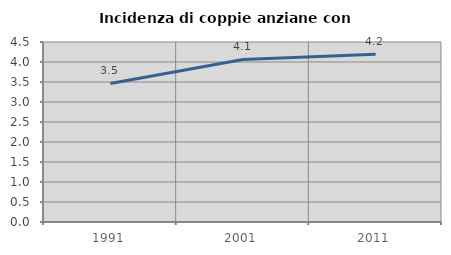
| Category | Incidenza di coppie anziane con figli |
|---|---|
| 1991.0 | 3.464 |
| 2001.0 | 4.064 |
| 2011.0 | 4.191 |